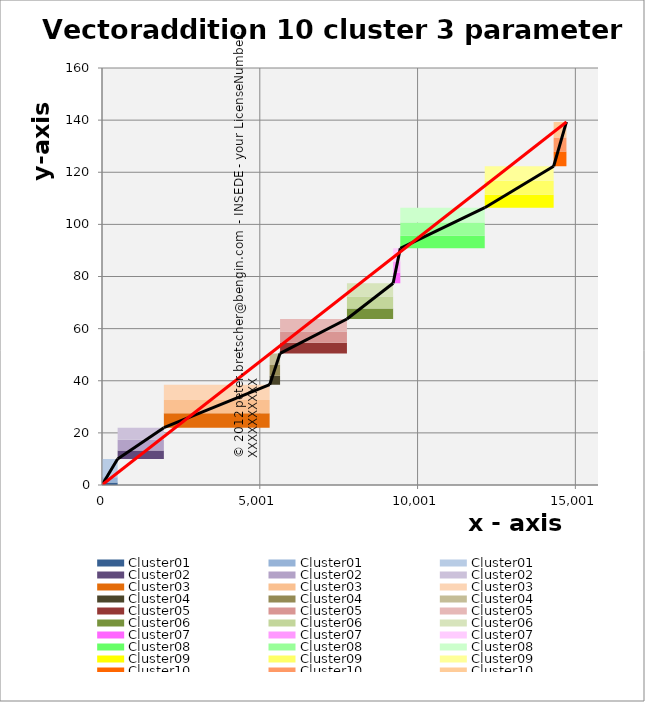
| Category | transparent | Cluster01 | Cluster02 | Cluster03 | Cluster04 | Cluster05 | Cluster06 | Cluster07 | Cluster08 | Cluster09 | Cluster10 | Border right & top |
|---|---|---|---|---|---|---|---|---|---|---|---|---|
| 0.0 | 0 | 7 | 0 | 0 | 0 | 0 | 0 | 0 | 0 | 0 | 0 | 0 |
| 494.6 | 0 | 7 | 0 | 0 | 0 | 0 | 0 | 0 | 0 | 0 | 0 | 0 |
| 494.6 | 10 | 0 | 4.6 | 0 | 0 | 0 | 0 | 0 | 0 | 0 | 0 | 0 |
| 1959.6999999999998 | 10 | 0 | 4.6 | 0 | 0 | 0 | 0 | 0 | 0 | 0 | 0 | 0 |
| 1959.6999999999998 | 22 | 0 | 0 | 5.9 | 0 | 0 | 0 | 0 | 0 | 0 | 0 | 0 |
| 5312.4 | 22 | 0 | 0 | 5.9 | 0 | 0 | 0 | 0 | 0 | 0 | 0 | 0 |
| 5312.4 | 38.5 | 0 | 0 | 0 | 4.5 | 0 | 0 | 0 | 0 | 0 | 0 | 0 |
| 5643.2 | 38.5 | 0 | 0 | 0 | 4.5 | 0 | 0 | 0 | 0 | 0 | 0 | 0 |
| 5643.2 | 50.5 | 0 | 0 | 0 | 0 | 4.8 | 0 | 0 | 0 | 0 | 0 | 0 |
| 7761.5 | 50.5 | 0 | 0 | 0 | 0 | 4.8 | 0 | 0 | 0 | 0 | 0 | 0 |
| 7761.5 | 63.7 | 0 | 0 | 0 | 0 | 0 | 5.1 | 0 | 0 | 0 | 0 | 0 |
| 9225.5 | 63.7 | 0 | 0 | 0 | 0 | 0 | 5.1 | 0 | 0 | 0 | 0 | 0 |
| 9225.5 | 77.4 | 0 | 0 | 0 | 0 | 0 | 0 | 5 | 0 | 0 | 0 | 0 |
| 9453.4 | 77.4 | 0 | 0 | 0 | 0 | 0 | 0 | 5 | 0 | 0 | 0 | 0 |
| 9453.4 | 90.8 | 0 | 0 | 0 | 0 | 0 | 0 | 0 | 5.7 | 0 | 0 | 0 |
| 12129.3 | 90.8 | 0 | 0 | 0 | 0 | 0 | 0 | 0 | 5.7 | 0 | 0 | 0 |
| 12129.3 | 106.4 | 0 | 0 | 0 | 0 | 0 | 0 | 0 | 0 | 5.6 | 0 | 0 |
| 14312.9 | 106.4 | 0 | 0 | 0 | 0 | 0 | 0 | 0 | 0 | 5.6 | 0 | 0 |
| 14312.9 | 122.3 | 0 | 0 | 0 | 0 | 0 | 0 | 0 | 0 | 0 | 6 | 0 |
| 14718.3 | 122.3 | 0 | 0 | 0 | 0 | 0 | 0 | 0 | 0 | 0 | 6 | 0 |
| 14718.3 | 139.3 | 0 | 0 | 0 | 0 | 0 | 0 | 0 | 0 | 0 | 0 | 0 |
| 15718.3 | 139.3 | 0 | 0 | 0 | 0 | 0 | 0 | 0 | 0 | 0 | 0 | 0 |
| 15718.3 | 139.3 | 0 | 0 | 0 | 0 | 0 | 0 | 0 | 0 | 0 | 0 | 0 |